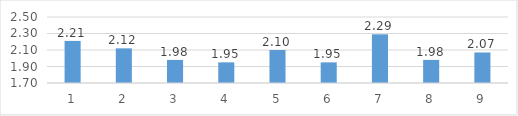
| Category | Series 0 |
|---|---|
| 0 | 2.21 |
| 1 | 2.12 |
| 2 | 1.98 |
| 3 | 1.95 |
| 4 | 2.1 |
| 5 | 1.95 |
| 6 | 2.29 |
| 7 | 1.98 |
| 8 | 2.07 |